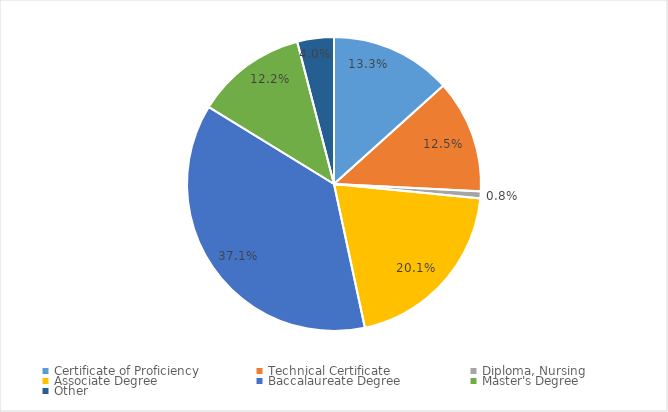
| Category | AY2016 |
|---|---|
| Certificate of Proficiency | 0.133 |
| Technical Certificate | 0.125 |
| Diploma, Nursing | 0.008 |
| Associate Degree | 0.201 |
| Baccalaureate Degree | 0.371 |
| Master's Degree | 0.122 |
| Other | 0.04 |